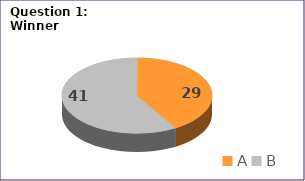
| Category | Series 0 |
|---|---|
| A | 29 |
| B | 41 |